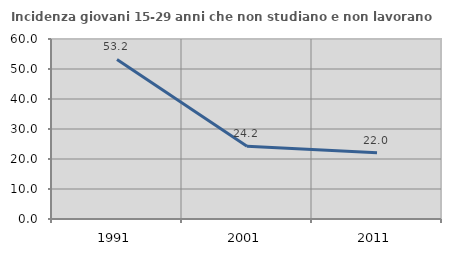
| Category | Incidenza giovani 15-29 anni che non studiano e non lavorano  |
|---|---|
| 1991.0 | 53.197 |
| 2001.0 | 24.233 |
| 2011.0 | 22.046 |